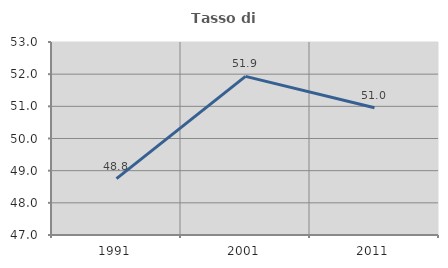
| Category | Tasso di occupazione   |
|---|---|
| 1991.0 | 48.753 |
| 2001.0 | 51.932 |
| 2011.0 | 50.954 |